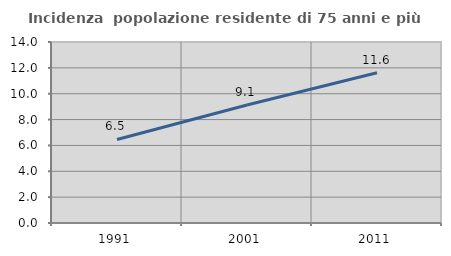
| Category | Incidenza  popolazione residente di 75 anni e più |
|---|---|
| 1991.0 | 6.462 |
| 2001.0 | 9.125 |
| 2011.0 | 11.623 |